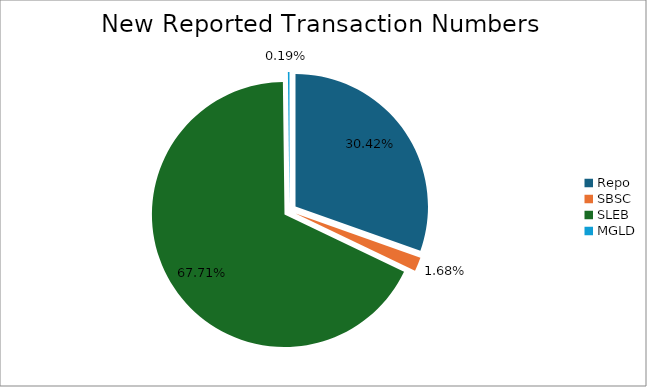
| Category | Series 0 |
|---|---|
| Repo | 467922 |
| SBSC | 25812 |
| SLEB | 1041515 |
| MGLD | 2989 |